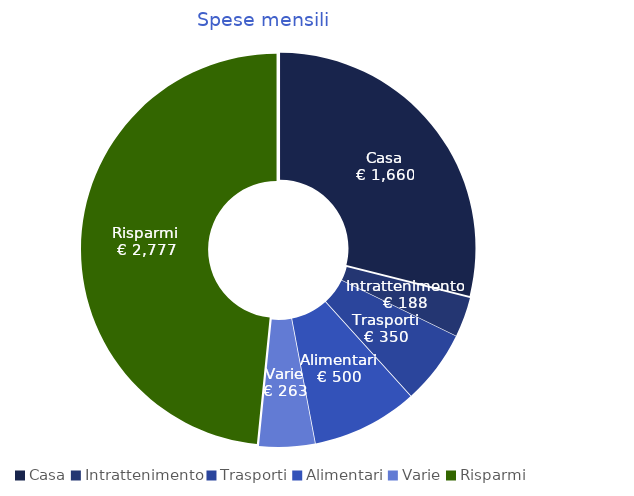
| Category | Series 0 |
|---|---|
| Casa | 1660 |
| Intrattenimento | 188 |
| Trasporti | 350 |
| Alimentari | 500 |
| Varie | 263 |
| Risparmi | 2777 |